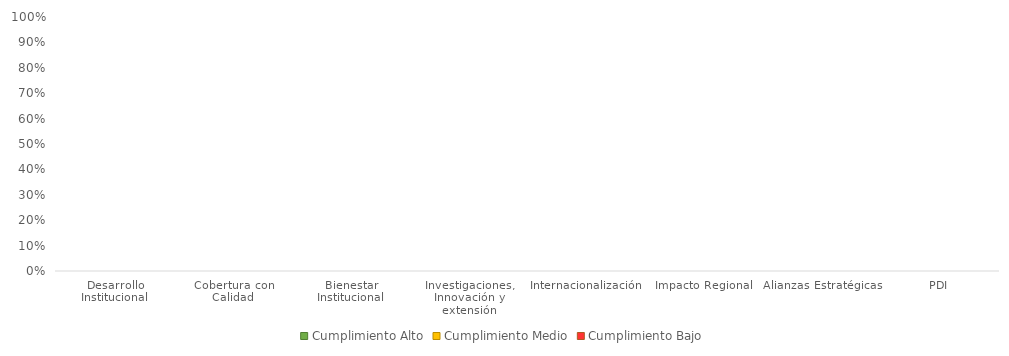
| Category | Cumplimiento Alto | Cumplimiento Medio | Cumplimiento Bajo |
|---|---|---|---|
| Desarrollo Institucional | 0 | 0 | 0 |
| Cobertura con Calidad | 0 | 0 | 0 |
| Bienestar Institucional | 0 | 0 | 0 |
| Investigaciones, Innovación y extensión | 0 | 0 | 0 |
| Internacionalización | 0 | 0 | 0 |
| Impacto Regional | 0 | 0 | 0 |
| Alianzas Estratégicas | 0 | 0 | 0 |
| PDI | 0 | 0 | 0 |